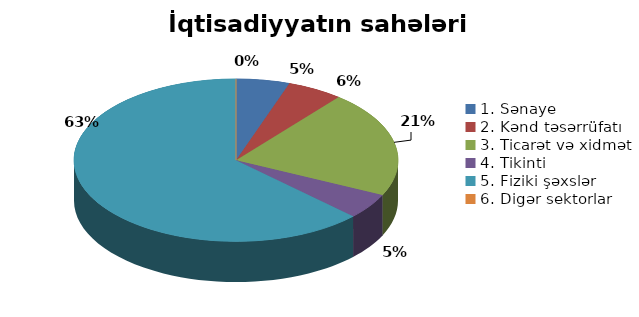
| Category | Series 0 |
|---|---|
| 1. Sənaye | 0.053 |
| 2. Kənd təsərrüfatı | 0.055 |
| 3. Ticarət və xidmət | 0.212 |
| 4. Tikinti | 0.051 |
| 5. Fiziki şəxslər | 0.629 |
| 6. Digər sektorlar | 0 |